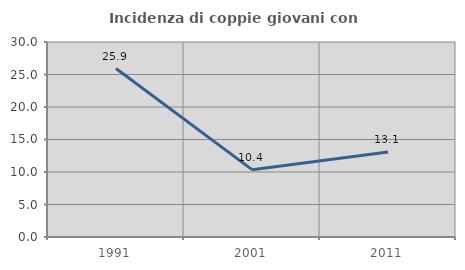
| Category | Incidenza di coppie giovani con figli |
|---|---|
| 1991.0 | 25.917 |
| 2001.0 | 10.36 |
| 2011.0 | 13.086 |